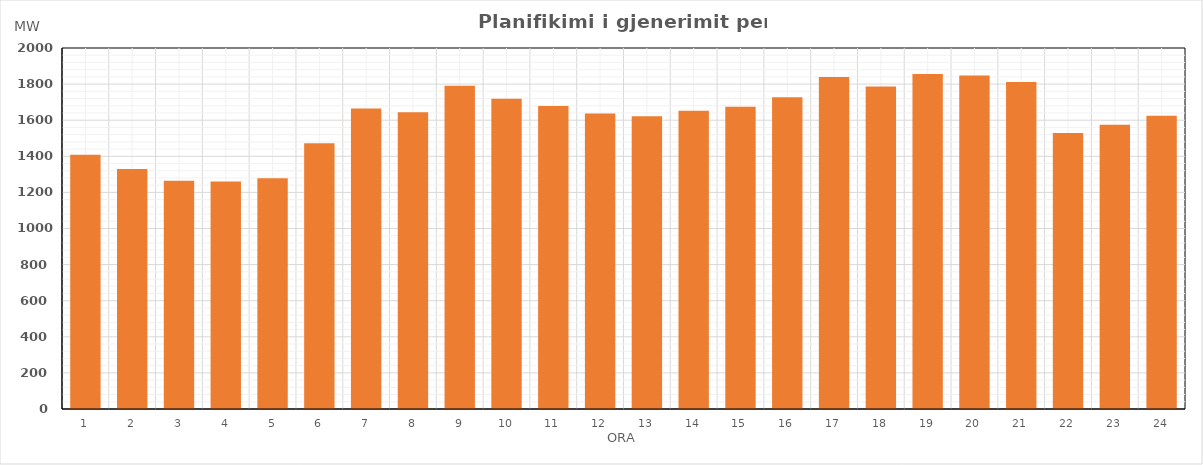
| Category | Max (MW) |
|---|---|
| 0 | 1408.59 |
| 1 | 1329.971 |
| 2 | 1265.088 |
| 3 | 1260.985 |
| 4 | 1278.324 |
| 5 | 1472.189 |
| 6 | 1664.797 |
| 7 | 1643.353 |
| 8 | 1790.693 |
| 9 | 1718.577 |
| 10 | 1678.794 |
| 11 | 1636.465 |
| 12 | 1621.703 |
| 13 | 1653.016 |
| 14 | 1674.92 |
| 15 | 1727.364 |
| 16 | 1838.687 |
| 17 | 1787.242 |
| 18 | 1855.545 |
| 19 | 1847.114 |
| 20 | 1811.317 |
| 21 | 1529.434 |
| 22 | 1575.374 |
| 23 | 1624.463 |